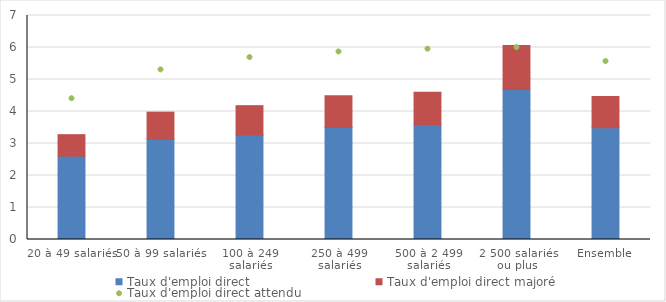
| Category | Taux d'emploi direct | Taux d'emploi direct majoré |
|---|---|---|
| 20 à 49 salariés | 2.605 | 0.671 |
| 50 à 99 salariés | 3.134 | 0.846 |
| 100 à 249 salariés | 3.266 | 0.917 |
| 250 à 499 salariés | 3.501 | 0.988 |
| 500 à 2 499 salariés | 3.584 | 1.014 |
| 2 500 salariés ou plus | 4.689 | 1.372 |
| Ensemble | 3.492 | 0.978 |